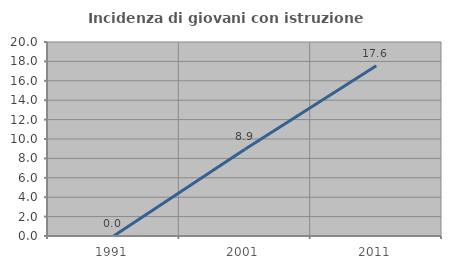
| Category | Incidenza di giovani con istruzione universitaria |
|---|---|
| 1991.0 | 0 |
| 2001.0 | 8.947 |
| 2011.0 | 17.561 |